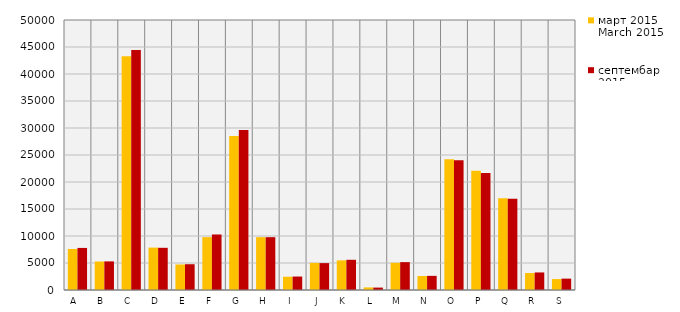
| Category | март 2015
March 2015 | септембар 2015
September 2015 |
|---|---|---|
| A  | 7588 | 7791 |
| B  | 5274 | 5297 |
| C  | 43272 | 44461 |
| D  | 7851 | 7813 |
| Е  | 4726 | 4772 |
| F  | 9784 | 10282 |
| G  | 28512 | 29646 |
| H  | 9782 | 9780 |
| I  | 2458 | 2493 |
| J  | 5022 | 4977 |
| K  | 5487 | 5594 |
| L  | 476 | 447 |
| M  | 5039 | 5158 |
| N  | 2598 | 2617 |
| O  | 24230 | 24039 |
| P  | 22103 | 21644 |
| Q  | 17001 | 16884 |
| R  | 3139 | 3251 |
| S  | 2024 | 2106 |